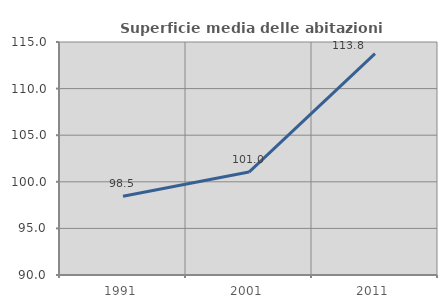
| Category | Superficie media delle abitazioni occupate |
|---|---|
| 1991.0 | 98.458 |
| 2001.0 | 101.048 |
| 2011.0 | 113.751 |